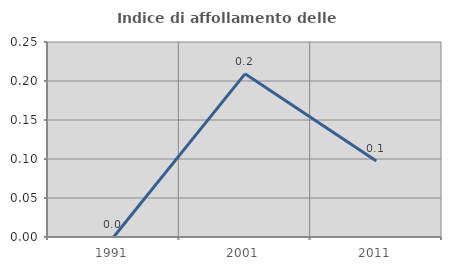
| Category | Indice di affollamento delle abitazioni  |
|---|---|
| 1991.0 | 0 |
| 2001.0 | 0.209 |
| 2011.0 | 0.097 |